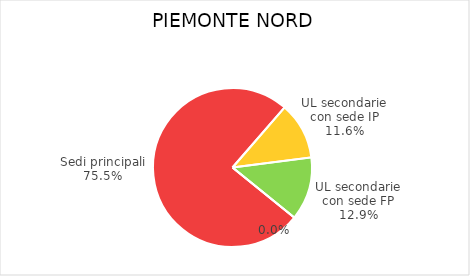
| Category | Piemonte Nord |
|---|---|
| Sedi principali | 41138 |
| UL secondarie con sede IP | 6312 |
| UL secondarie con sede FP | 7006 |